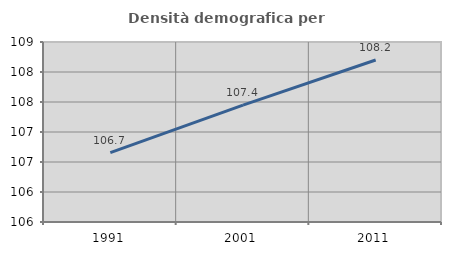
| Category | Densità demografica |
|---|---|
| 1991.0 | 106.657 |
| 2001.0 | 107.449 |
| 2011.0 | 108.199 |